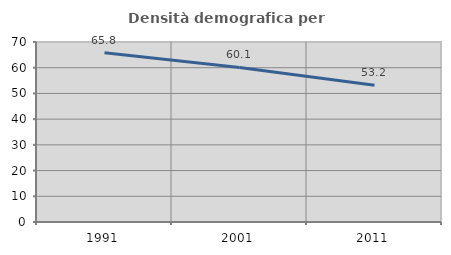
| Category | Densità demografica |
|---|---|
| 1991.0 | 65.805 |
| 2001.0 | 60.092 |
| 2011.0 | 53.189 |